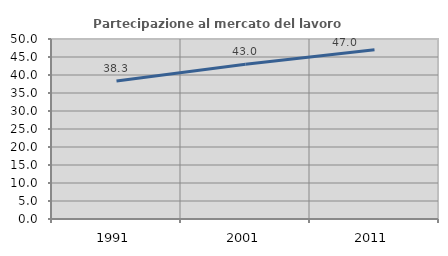
| Category | Partecipazione al mercato del lavoro  femminile |
|---|---|
| 1991.0 | 38.311 |
| 2001.0 | 42.958 |
| 2011.0 | 46.997 |